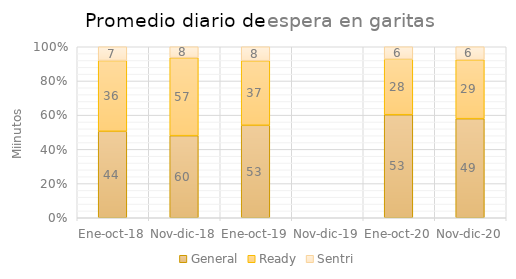
| Category | General | Ready | Sentri |
|---|---|---|---|
| Ene-oct-18 | 44 | 36 | 7 |
| Nov-dic-18 | 60 | 57 | 8 |
| Ene-oct-19 | 53 | 37 | 8 |
| Nov-dic-19 | 0 | 0 | 0 |
| Ene-oct-20 | 52.557 | 28.357 | 6.324 |
| Nov-dic-20 | 49.176 | 29.255 | 6.448 |